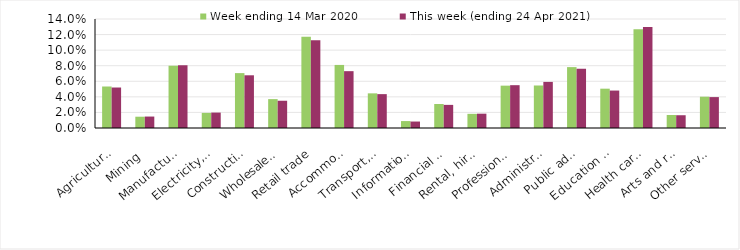
| Category | Week ending 14 Mar 2020 | This week (ending 24 Apr 2021) |
|---|---|---|
| Agriculture, forestry and fishing | 0.053 | 0.052 |
| Mining | 0.014 | 0.015 |
| Manufacturing | 0.08 | 0.081 |
| Electricity, gas, water and waste services | 0.019 | 0.02 |
| Construction | 0.07 | 0.068 |
| Wholesale trade | 0.037 | 0.035 |
| Retail trade | 0.117 | 0.113 |
| Accommodation and food services | 0.081 | 0.073 |
| Transport, postal and warehousing | 0.044 | 0.044 |
| Information media and telecommunications | 0.009 | 0.008 |
| Financial and insurance services | 0.031 | 0.03 |
| Rental, hiring and real estate services | 0.018 | 0.018 |
| Professional, scientific and technical services | 0.054 | 0.055 |
| Administrative and support services | 0.055 | 0.059 |
| Public administration and safety | 0.078 | 0.076 |
| Education and training | 0.05 | 0.048 |
| Health care and social assistance | 0.127 | 0.13 |
| Arts and recreation services | 0.017 | 0.016 |
| Other services | 0.04 | 0.04 |